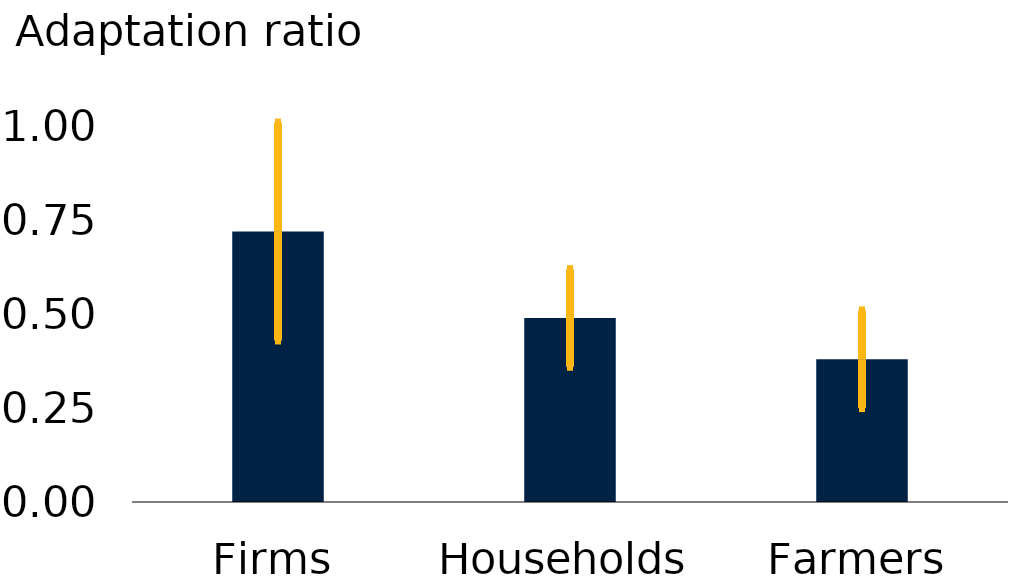
| Category | b |
|---|---|
| Firms | 0.72 |
| Households | 0.49 |
| Farmers | 0.38 |